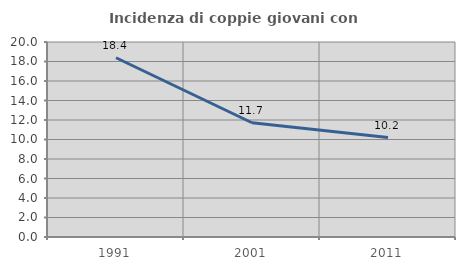
| Category | Incidenza di coppie giovani con figli |
|---|---|
| 1991.0 | 18.385 |
| 2001.0 | 11.719 |
| 2011.0 | 10.195 |